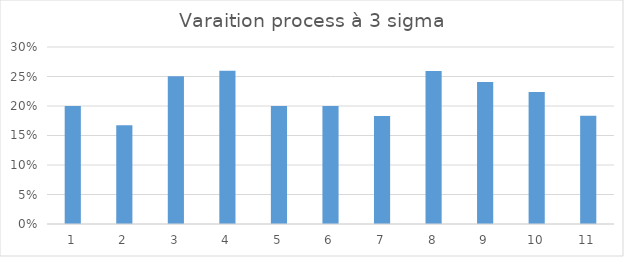
| Category | Series 0 |
|---|---|
| 1.0 | 0.2 |
| 2.0 | 0.167 |
| 3.0 | 0.25 |
| 4.0 | 0.26 |
| 5.0 | 0.2 |
| 6.0 | 0.2 |
| 7.0 | 0.183 |
| 8.0 | 0.259 |
| 9.0 | 0.241 |
| 10.0 | 0.224 |
| 11.0 | 0.183 |